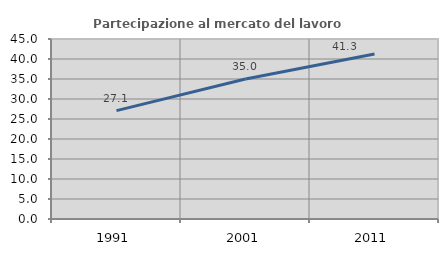
| Category | Partecipazione al mercato del lavoro  femminile |
|---|---|
| 1991.0 | 27.086 |
| 2001.0 | 34.994 |
| 2011.0 | 41.256 |